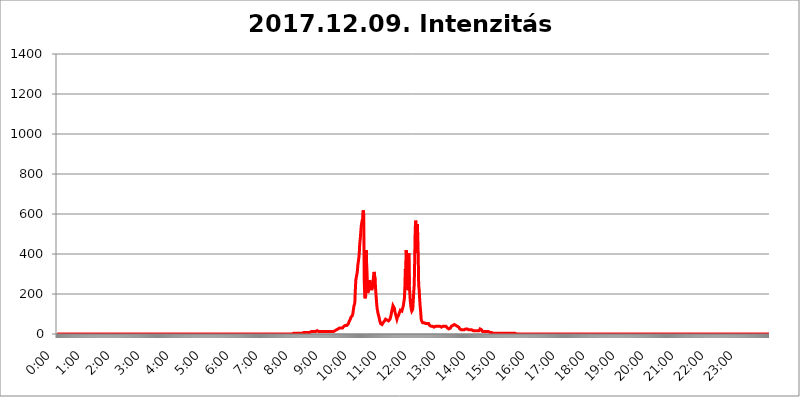
| Category | 2017.12.09. Intenzitás [W/m^2] |
|---|---|
| 0.0 | 0 |
| 0.0006944444444444445 | 0 |
| 0.001388888888888889 | 0 |
| 0.0020833333333333333 | 0 |
| 0.002777777777777778 | 0 |
| 0.003472222222222222 | 0 |
| 0.004166666666666667 | 0 |
| 0.004861111111111111 | 0 |
| 0.005555555555555556 | 0 |
| 0.0062499999999999995 | 0 |
| 0.006944444444444444 | 0 |
| 0.007638888888888889 | 0 |
| 0.008333333333333333 | 0 |
| 0.009027777777777779 | 0 |
| 0.009722222222222222 | 0 |
| 0.010416666666666666 | 0 |
| 0.011111111111111112 | 0 |
| 0.011805555555555555 | 0 |
| 0.012499999999999999 | 0 |
| 0.013194444444444444 | 0 |
| 0.013888888888888888 | 0 |
| 0.014583333333333332 | 0 |
| 0.015277777777777777 | 0 |
| 0.015972222222222224 | 0 |
| 0.016666666666666666 | 0 |
| 0.017361111111111112 | 0 |
| 0.018055555555555557 | 0 |
| 0.01875 | 0 |
| 0.019444444444444445 | 0 |
| 0.02013888888888889 | 0 |
| 0.020833333333333332 | 0 |
| 0.02152777777777778 | 0 |
| 0.022222222222222223 | 0 |
| 0.02291666666666667 | 0 |
| 0.02361111111111111 | 0 |
| 0.024305555555555556 | 0 |
| 0.024999999999999998 | 0 |
| 0.025694444444444447 | 0 |
| 0.02638888888888889 | 0 |
| 0.027083333333333334 | 0 |
| 0.027777777777777776 | 0 |
| 0.02847222222222222 | 0 |
| 0.029166666666666664 | 0 |
| 0.029861111111111113 | 0 |
| 0.030555555555555555 | 0 |
| 0.03125 | 0 |
| 0.03194444444444445 | 0 |
| 0.03263888888888889 | 0 |
| 0.03333333333333333 | 0 |
| 0.034027777777777775 | 0 |
| 0.034722222222222224 | 0 |
| 0.035416666666666666 | 0 |
| 0.036111111111111115 | 0 |
| 0.03680555555555556 | 0 |
| 0.0375 | 0 |
| 0.03819444444444444 | 0 |
| 0.03888888888888889 | 0 |
| 0.03958333333333333 | 0 |
| 0.04027777777777778 | 0 |
| 0.04097222222222222 | 0 |
| 0.041666666666666664 | 0 |
| 0.042361111111111106 | 0 |
| 0.04305555555555556 | 0 |
| 0.043750000000000004 | 0 |
| 0.044444444444444446 | 0 |
| 0.04513888888888889 | 0 |
| 0.04583333333333334 | 0 |
| 0.04652777777777778 | 0 |
| 0.04722222222222222 | 0 |
| 0.04791666666666666 | 0 |
| 0.04861111111111111 | 0 |
| 0.049305555555555554 | 0 |
| 0.049999999999999996 | 0 |
| 0.05069444444444445 | 0 |
| 0.051388888888888894 | 0 |
| 0.052083333333333336 | 0 |
| 0.05277777777777778 | 0 |
| 0.05347222222222222 | 0 |
| 0.05416666666666667 | 0 |
| 0.05486111111111111 | 0 |
| 0.05555555555555555 | 0 |
| 0.05625 | 0 |
| 0.05694444444444444 | 0 |
| 0.057638888888888885 | 0 |
| 0.05833333333333333 | 0 |
| 0.05902777777777778 | 0 |
| 0.059722222222222225 | 0 |
| 0.06041666666666667 | 0 |
| 0.061111111111111116 | 0 |
| 0.06180555555555556 | 0 |
| 0.0625 | 0 |
| 0.06319444444444444 | 0 |
| 0.06388888888888888 | 0 |
| 0.06458333333333334 | 0 |
| 0.06527777777777778 | 0 |
| 0.06597222222222222 | 0 |
| 0.06666666666666667 | 0 |
| 0.06736111111111111 | 0 |
| 0.06805555555555555 | 0 |
| 0.06874999999999999 | 0 |
| 0.06944444444444443 | 0 |
| 0.07013888888888889 | 0 |
| 0.07083333333333333 | 0 |
| 0.07152777777777779 | 0 |
| 0.07222222222222223 | 0 |
| 0.07291666666666667 | 0 |
| 0.07361111111111111 | 0 |
| 0.07430555555555556 | 0 |
| 0.075 | 0 |
| 0.07569444444444444 | 0 |
| 0.0763888888888889 | 0 |
| 0.07708333333333334 | 0 |
| 0.07777777777777778 | 0 |
| 0.07847222222222222 | 0 |
| 0.07916666666666666 | 0 |
| 0.0798611111111111 | 0 |
| 0.08055555555555556 | 0 |
| 0.08125 | 0 |
| 0.08194444444444444 | 0 |
| 0.08263888888888889 | 0 |
| 0.08333333333333333 | 0 |
| 0.08402777777777777 | 0 |
| 0.08472222222222221 | 0 |
| 0.08541666666666665 | 0 |
| 0.08611111111111112 | 0 |
| 0.08680555555555557 | 0 |
| 0.08750000000000001 | 0 |
| 0.08819444444444445 | 0 |
| 0.08888888888888889 | 0 |
| 0.08958333333333333 | 0 |
| 0.09027777777777778 | 0 |
| 0.09097222222222222 | 0 |
| 0.09166666666666667 | 0 |
| 0.09236111111111112 | 0 |
| 0.09305555555555556 | 0 |
| 0.09375 | 0 |
| 0.09444444444444444 | 0 |
| 0.09513888888888888 | 0 |
| 0.09583333333333333 | 0 |
| 0.09652777777777777 | 0 |
| 0.09722222222222222 | 0 |
| 0.09791666666666667 | 0 |
| 0.09861111111111111 | 0 |
| 0.09930555555555555 | 0 |
| 0.09999999999999999 | 0 |
| 0.10069444444444443 | 0 |
| 0.1013888888888889 | 0 |
| 0.10208333333333335 | 0 |
| 0.10277777777777779 | 0 |
| 0.10347222222222223 | 0 |
| 0.10416666666666667 | 0 |
| 0.10486111111111111 | 0 |
| 0.10555555555555556 | 0 |
| 0.10625 | 0 |
| 0.10694444444444444 | 0 |
| 0.1076388888888889 | 0 |
| 0.10833333333333334 | 0 |
| 0.10902777777777778 | 0 |
| 0.10972222222222222 | 0 |
| 0.1111111111111111 | 0 |
| 0.11180555555555556 | 0 |
| 0.11180555555555556 | 0 |
| 0.1125 | 0 |
| 0.11319444444444444 | 0 |
| 0.11388888888888889 | 0 |
| 0.11458333333333333 | 0 |
| 0.11527777777777777 | 0 |
| 0.11597222222222221 | 0 |
| 0.11666666666666665 | 0 |
| 0.1173611111111111 | 0 |
| 0.11805555555555557 | 0 |
| 0.11944444444444445 | 0 |
| 0.12013888888888889 | 0 |
| 0.12083333333333333 | 0 |
| 0.12152777777777778 | 0 |
| 0.12222222222222223 | 0 |
| 0.12291666666666667 | 0 |
| 0.12291666666666667 | 0 |
| 0.12361111111111112 | 0 |
| 0.12430555555555556 | 0 |
| 0.125 | 0 |
| 0.12569444444444444 | 0 |
| 0.12638888888888888 | 0 |
| 0.12708333333333333 | 0 |
| 0.16875 | 0 |
| 0.12847222222222224 | 0 |
| 0.12916666666666668 | 0 |
| 0.12986111111111112 | 0 |
| 0.13055555555555556 | 0 |
| 0.13125 | 0 |
| 0.13194444444444445 | 0 |
| 0.1326388888888889 | 0 |
| 0.13333333333333333 | 0 |
| 0.13402777777777777 | 0 |
| 0.13402777777777777 | 0 |
| 0.13472222222222222 | 0 |
| 0.13541666666666666 | 0 |
| 0.1361111111111111 | 0 |
| 0.13749999999999998 | 0 |
| 0.13819444444444443 | 0 |
| 0.1388888888888889 | 0 |
| 0.13958333333333334 | 0 |
| 0.14027777777777778 | 0 |
| 0.14097222222222222 | 0 |
| 0.14166666666666666 | 0 |
| 0.1423611111111111 | 0 |
| 0.14305555555555557 | 0 |
| 0.14375000000000002 | 0 |
| 0.14444444444444446 | 0 |
| 0.1451388888888889 | 0 |
| 0.1451388888888889 | 0 |
| 0.14652777777777778 | 0 |
| 0.14722222222222223 | 0 |
| 0.14791666666666667 | 0 |
| 0.1486111111111111 | 0 |
| 0.14930555555555555 | 0 |
| 0.15 | 0 |
| 0.15069444444444444 | 0 |
| 0.15138888888888888 | 0 |
| 0.15208333333333332 | 0 |
| 0.15277777777777776 | 0 |
| 0.15347222222222223 | 0 |
| 0.15416666666666667 | 0 |
| 0.15486111111111112 | 0 |
| 0.15555555555555556 | 0 |
| 0.15625 | 0 |
| 0.15694444444444444 | 0 |
| 0.15763888888888888 | 0 |
| 0.15833333333333333 | 0 |
| 0.15902777777777777 | 0 |
| 0.15972222222222224 | 0 |
| 0.16041666666666668 | 0 |
| 0.16111111111111112 | 0 |
| 0.16180555555555556 | 0 |
| 0.1625 | 0 |
| 0.16319444444444445 | 0 |
| 0.1638888888888889 | 0 |
| 0.16458333333333333 | 0 |
| 0.16527777777777777 | 0 |
| 0.16597222222222222 | 0 |
| 0.16666666666666666 | 0 |
| 0.1673611111111111 | 0 |
| 0.16805555555555554 | 0 |
| 0.16874999999999998 | 0 |
| 0.16944444444444443 | 0 |
| 0.17013888888888887 | 0 |
| 0.1708333333333333 | 0 |
| 0.17152777777777775 | 0 |
| 0.17222222222222225 | 0 |
| 0.1729166666666667 | 0 |
| 0.17361111111111113 | 0 |
| 0.17430555555555557 | 0 |
| 0.17500000000000002 | 0 |
| 0.17569444444444446 | 0 |
| 0.1763888888888889 | 0 |
| 0.17708333333333334 | 0 |
| 0.17777777777777778 | 0 |
| 0.17847222222222223 | 0 |
| 0.17916666666666667 | 0 |
| 0.1798611111111111 | 0 |
| 0.18055555555555555 | 0 |
| 0.18125 | 0 |
| 0.18194444444444444 | 0 |
| 0.1826388888888889 | 0 |
| 0.18333333333333335 | 0 |
| 0.1840277777777778 | 0 |
| 0.18472222222222223 | 0 |
| 0.18541666666666667 | 0 |
| 0.18611111111111112 | 0 |
| 0.18680555555555556 | 0 |
| 0.1875 | 0 |
| 0.18819444444444444 | 0 |
| 0.18888888888888888 | 0 |
| 0.18958333333333333 | 0 |
| 0.19027777777777777 | 0 |
| 0.1909722222222222 | 0 |
| 0.19166666666666665 | 0 |
| 0.19236111111111112 | 0 |
| 0.19305555555555554 | 0 |
| 0.19375 | 0 |
| 0.19444444444444445 | 0 |
| 0.1951388888888889 | 0 |
| 0.19583333333333333 | 0 |
| 0.19652777777777777 | 0 |
| 0.19722222222222222 | 0 |
| 0.19791666666666666 | 0 |
| 0.1986111111111111 | 0 |
| 0.19930555555555554 | 0 |
| 0.19999999999999998 | 0 |
| 0.20069444444444443 | 0 |
| 0.20138888888888887 | 0 |
| 0.2020833333333333 | 0 |
| 0.2027777777777778 | 0 |
| 0.2034722222222222 | 0 |
| 0.2041666666666667 | 0 |
| 0.20486111111111113 | 0 |
| 0.20555555555555557 | 0 |
| 0.20625000000000002 | 0 |
| 0.20694444444444446 | 0 |
| 0.2076388888888889 | 0 |
| 0.20833333333333334 | 0 |
| 0.20902777777777778 | 0 |
| 0.20972222222222223 | 0 |
| 0.21041666666666667 | 0 |
| 0.2111111111111111 | 0 |
| 0.21180555555555555 | 0 |
| 0.2125 | 0 |
| 0.21319444444444444 | 0 |
| 0.2138888888888889 | 0 |
| 0.21458333333333335 | 0 |
| 0.2152777777777778 | 0 |
| 0.21597222222222223 | 0 |
| 0.21666666666666667 | 0 |
| 0.21736111111111112 | 0 |
| 0.21805555555555556 | 0 |
| 0.21875 | 0 |
| 0.21944444444444444 | 0 |
| 0.22013888888888888 | 0 |
| 0.22083333333333333 | 0 |
| 0.22152777777777777 | 0 |
| 0.2222222222222222 | 0 |
| 0.22291666666666665 | 0 |
| 0.2236111111111111 | 0 |
| 0.22430555555555556 | 0 |
| 0.225 | 0 |
| 0.22569444444444445 | 0 |
| 0.2263888888888889 | 0 |
| 0.22708333333333333 | 0 |
| 0.22777777777777777 | 0 |
| 0.22847222222222222 | 0 |
| 0.22916666666666666 | 0 |
| 0.2298611111111111 | 0 |
| 0.23055555555555554 | 0 |
| 0.23124999999999998 | 0 |
| 0.23194444444444443 | 0 |
| 0.23263888888888887 | 0 |
| 0.2333333333333333 | 0 |
| 0.2340277777777778 | 0 |
| 0.2347222222222222 | 0 |
| 0.2354166666666667 | 0 |
| 0.23611111111111113 | 0 |
| 0.23680555555555557 | 0 |
| 0.23750000000000002 | 0 |
| 0.23819444444444446 | 0 |
| 0.2388888888888889 | 0 |
| 0.23958333333333334 | 0 |
| 0.24027777777777778 | 0 |
| 0.24097222222222223 | 0 |
| 0.24166666666666667 | 0 |
| 0.2423611111111111 | 0 |
| 0.24305555555555555 | 0 |
| 0.24375 | 0 |
| 0.24444444444444446 | 0 |
| 0.24513888888888888 | 0 |
| 0.24583333333333335 | 0 |
| 0.2465277777777778 | 0 |
| 0.24722222222222223 | 0 |
| 0.24791666666666667 | 0 |
| 0.24861111111111112 | 0 |
| 0.24930555555555556 | 0 |
| 0.25 | 0 |
| 0.25069444444444444 | 0 |
| 0.2513888888888889 | 0 |
| 0.2520833333333333 | 0 |
| 0.25277777777777777 | 0 |
| 0.2534722222222222 | 0 |
| 0.25416666666666665 | 0 |
| 0.2548611111111111 | 0 |
| 0.2555555555555556 | 0 |
| 0.25625000000000003 | 0 |
| 0.2569444444444445 | 0 |
| 0.2576388888888889 | 0 |
| 0.25833333333333336 | 0 |
| 0.2590277777777778 | 0 |
| 0.25972222222222224 | 0 |
| 0.2604166666666667 | 0 |
| 0.2611111111111111 | 0 |
| 0.26180555555555557 | 0 |
| 0.2625 | 0 |
| 0.26319444444444445 | 0 |
| 0.2638888888888889 | 0 |
| 0.26458333333333334 | 0 |
| 0.2652777777777778 | 0 |
| 0.2659722222222222 | 0 |
| 0.26666666666666666 | 0 |
| 0.2673611111111111 | 0 |
| 0.26805555555555555 | 0 |
| 0.26875 | 0 |
| 0.26944444444444443 | 0 |
| 0.2701388888888889 | 0 |
| 0.2708333333333333 | 0 |
| 0.27152777777777776 | 0 |
| 0.2722222222222222 | 0 |
| 0.27291666666666664 | 0 |
| 0.2736111111111111 | 0 |
| 0.2743055555555555 | 0 |
| 0.27499999999999997 | 0 |
| 0.27569444444444446 | 0 |
| 0.27638888888888885 | 0 |
| 0.27708333333333335 | 0 |
| 0.2777777777777778 | 0 |
| 0.27847222222222223 | 0 |
| 0.2791666666666667 | 0 |
| 0.2798611111111111 | 0 |
| 0.28055555555555556 | 0 |
| 0.28125 | 0 |
| 0.28194444444444444 | 0 |
| 0.2826388888888889 | 0 |
| 0.2833333333333333 | 0 |
| 0.28402777777777777 | 0 |
| 0.2847222222222222 | 0 |
| 0.28541666666666665 | 0 |
| 0.28611111111111115 | 0 |
| 0.28680555555555554 | 0 |
| 0.28750000000000003 | 0 |
| 0.2881944444444445 | 0 |
| 0.2888888888888889 | 0 |
| 0.28958333333333336 | 0 |
| 0.2902777777777778 | 0 |
| 0.29097222222222224 | 0 |
| 0.2916666666666667 | 0 |
| 0.2923611111111111 | 0 |
| 0.29305555555555557 | 0 |
| 0.29375 | 0 |
| 0.29444444444444445 | 0 |
| 0.2951388888888889 | 0 |
| 0.29583333333333334 | 0 |
| 0.2965277777777778 | 0 |
| 0.2972222222222222 | 0 |
| 0.29791666666666666 | 0 |
| 0.2986111111111111 | 0 |
| 0.29930555555555555 | 0 |
| 0.3 | 0 |
| 0.30069444444444443 | 0 |
| 0.3013888888888889 | 0 |
| 0.3020833333333333 | 0 |
| 0.30277777777777776 | 0 |
| 0.3034722222222222 | 0 |
| 0.30416666666666664 | 0 |
| 0.3048611111111111 | 0 |
| 0.3055555555555555 | 0 |
| 0.30624999999999997 | 0 |
| 0.3069444444444444 | 0 |
| 0.3076388888888889 | 0 |
| 0.30833333333333335 | 0 |
| 0.3090277777777778 | 0 |
| 0.30972222222222223 | 0 |
| 0.3104166666666667 | 0 |
| 0.3111111111111111 | 0 |
| 0.31180555555555556 | 0 |
| 0.3125 | 0 |
| 0.31319444444444444 | 0 |
| 0.3138888888888889 | 0 |
| 0.3145833333333333 | 0 |
| 0.31527777777777777 | 0 |
| 0.3159722222222222 | 0 |
| 0.31666666666666665 | 0 |
| 0.31736111111111115 | 0 |
| 0.31805555555555554 | 0 |
| 0.31875000000000003 | 0 |
| 0.3194444444444445 | 0 |
| 0.3201388888888889 | 0 |
| 0.32083333333333336 | 0 |
| 0.3215277777777778 | 0 |
| 0.32222222222222224 | 0 |
| 0.3229166666666667 | 0 |
| 0.3236111111111111 | 0 |
| 0.32430555555555557 | 0 |
| 0.325 | 0 |
| 0.32569444444444445 | 0 |
| 0.3263888888888889 | 0 |
| 0.32708333333333334 | 0 |
| 0.3277777777777778 | 0 |
| 0.3284722222222222 | 3.525 |
| 0.32916666666666666 | 0 |
| 0.3298611111111111 | 3.525 |
| 0.33055555555555555 | 3.525 |
| 0.33125 | 3.525 |
| 0.33194444444444443 | 3.525 |
| 0.3326388888888889 | 3.525 |
| 0.3333333333333333 | 3.525 |
| 0.3340277777777778 | 3.525 |
| 0.3347222222222222 | 3.525 |
| 0.3354166666666667 | 3.525 |
| 0.3361111111111111 | 3.525 |
| 0.3368055555555556 | 3.525 |
| 0.33749999999999997 | 3.525 |
| 0.33819444444444446 | 3.525 |
| 0.33888888888888885 | 3.525 |
| 0.33958333333333335 | 3.525 |
| 0.34027777777777773 | 3.525 |
| 0.34097222222222223 | 3.525 |
| 0.3416666666666666 | 3.525 |
| 0.3423611111111111 | 3.525 |
| 0.3430555555555555 | 3.525 |
| 0.34375 | 3.525 |
| 0.3444444444444445 | 3.525 |
| 0.3451388888888889 | 7.887 |
| 0.3458333333333334 | 7.887 |
| 0.34652777777777777 | 7.887 |
| 0.34722222222222227 | 7.887 |
| 0.34791666666666665 | 7.887 |
| 0.34861111111111115 | 7.887 |
| 0.34930555555555554 | 7.887 |
| 0.35000000000000003 | 7.887 |
| 0.3506944444444444 | 7.887 |
| 0.3513888888888889 | 7.887 |
| 0.3520833333333333 | 7.887 |
| 0.3527777777777778 | 7.887 |
| 0.3534722222222222 | 7.887 |
| 0.3541666666666667 | 7.887 |
| 0.3548611111111111 | 7.887 |
| 0.35555555555555557 | 12.257 |
| 0.35625 | 12.257 |
| 0.35694444444444445 | 12.257 |
| 0.3576388888888889 | 12.257 |
| 0.35833333333333334 | 12.257 |
| 0.3590277777777778 | 12.257 |
| 0.3597222222222222 | 12.257 |
| 0.36041666666666666 | 12.257 |
| 0.3611111111111111 | 12.257 |
| 0.36180555555555555 | 12.257 |
| 0.3625 | 12.257 |
| 0.36319444444444443 | 12.257 |
| 0.3638888888888889 | 12.257 |
| 0.3645833333333333 | 16.636 |
| 0.3652777777777778 | 16.636 |
| 0.3659722222222222 | 16.636 |
| 0.3666666666666667 | 12.257 |
| 0.3673611111111111 | 12.257 |
| 0.3680555555555556 | 16.636 |
| 0.36874999999999997 | 12.257 |
| 0.36944444444444446 | 12.257 |
| 0.37013888888888885 | 12.257 |
| 0.37083333333333335 | 12.257 |
| 0.37152777777777773 | 12.257 |
| 0.37222222222222223 | 12.257 |
| 0.3729166666666666 | 12.257 |
| 0.3736111111111111 | 12.257 |
| 0.3743055555555555 | 12.257 |
| 0.375 | 12.257 |
| 0.3756944444444445 | 12.257 |
| 0.3763888888888889 | 12.257 |
| 0.3770833333333334 | 12.257 |
| 0.37777777777777777 | 12.257 |
| 0.37847222222222227 | 12.257 |
| 0.37916666666666665 | 12.257 |
| 0.37986111111111115 | 12.257 |
| 0.38055555555555554 | 12.257 |
| 0.38125000000000003 | 12.257 |
| 0.3819444444444444 | 12.257 |
| 0.3826388888888889 | 12.257 |
| 0.3833333333333333 | 12.257 |
| 0.3840277777777778 | 12.257 |
| 0.3847222222222222 | 12.257 |
| 0.3854166666666667 | 12.257 |
| 0.3861111111111111 | 12.257 |
| 0.38680555555555557 | 12.257 |
| 0.3875 | 12.257 |
| 0.38819444444444445 | 12.257 |
| 0.3888888888888889 | 16.636 |
| 0.38958333333333334 | 16.636 |
| 0.3902777777777778 | 21.024 |
| 0.3909722222222222 | 21.024 |
| 0.39166666666666666 | 21.024 |
| 0.3923611111111111 | 25.419 |
| 0.39305555555555555 | 25.419 |
| 0.39375 | 25.419 |
| 0.39444444444444443 | 25.419 |
| 0.3951388888888889 | 25.419 |
| 0.3958333333333333 | 29.823 |
| 0.3965277777777778 | 29.823 |
| 0.3972222222222222 | 29.823 |
| 0.3979166666666667 | 29.823 |
| 0.3986111111111111 | 29.823 |
| 0.3993055555555556 | 29.823 |
| 0.39999999999999997 | 29.823 |
| 0.40069444444444446 | 34.234 |
| 0.40138888888888885 | 34.234 |
| 0.40208333333333335 | 38.653 |
| 0.40277777777777773 | 38.653 |
| 0.40347222222222223 | 43.079 |
| 0.4041666666666666 | 43.079 |
| 0.4048611111111111 | 43.079 |
| 0.4055555555555555 | 43.079 |
| 0.40625 | 43.079 |
| 0.4069444444444445 | 43.079 |
| 0.4076388888888889 | 47.511 |
| 0.4083333333333334 | 51.951 |
| 0.40902777777777777 | 56.398 |
| 0.40972222222222227 | 65.31 |
| 0.41041666666666665 | 69.775 |
| 0.41111111111111115 | 74.246 |
| 0.41180555555555554 | 83.205 |
| 0.41250000000000003 | 83.205 |
| 0.4131944444444444 | 87.692 |
| 0.4138888888888889 | 92.184 |
| 0.4145833333333333 | 101.184 |
| 0.4152777777777778 | 119.235 |
| 0.4159722222222222 | 137.347 |
| 0.4166666666666667 | 146.423 |
| 0.4173611111111111 | 155.509 |
| 0.41805555555555557 | 219.309 |
| 0.41875 | 269.49 |
| 0.41944444444444445 | 283.156 |
| 0.4201388888888889 | 296.808 |
| 0.42083333333333334 | 310.44 |
| 0.4215277777777778 | 342.162 |
| 0.4222222222222222 | 360.221 |
| 0.42291666666666666 | 378.224 |
| 0.4236111111111111 | 405.108 |
| 0.42430555555555555 | 453.968 |
| 0.425 | 475.972 |
| 0.42569444444444443 | 475.972 |
| 0.4263888888888889 | 541.121 |
| 0.4270833333333333 | 536.82 |
| 0.4277777777777778 | 571.049 |
| 0.4284722222222222 | 562.53 |
| 0.4291666666666667 | 617.436 |
| 0.4298611111111111 | 596.45 |
| 0.4305555555555556 | 269.49 |
| 0.43124999999999997 | 187.378 |
| 0.43194444444444446 | 178.264 |
| 0.43263888888888885 | 191.937 |
| 0.43333333333333335 | 418.492 |
| 0.43402777777777773 | 422.943 |
| 0.43472222222222223 | 233 |
| 0.4354166666666666 | 205.62 |
| 0.4361111111111111 | 201.058 |
| 0.4368055555555555 | 210.182 |
| 0.4375 | 228.436 |
| 0.4381944444444445 | 269.49 |
| 0.4388888888888889 | 264.932 |
| 0.4395833333333334 | 269.49 |
| 0.44027777777777777 | 228.436 |
| 0.44097222222222227 | 219.309 |
| 0.44166666666666665 | 223.873 |
| 0.44236111111111115 | 242.127 |
| 0.44305555555555554 | 264.932 |
| 0.44375000000000003 | 292.259 |
| 0.4444444444444444 | 310.44 |
| 0.4451388888888889 | 305.898 |
| 0.4458333333333333 | 269.49 |
| 0.4465277777777778 | 223.873 |
| 0.4472222222222222 | 187.378 |
| 0.4479166666666667 | 155.509 |
| 0.4486111111111111 | 128.284 |
| 0.44930555555555557 | 114.716 |
| 0.45 | 101.184 |
| 0.45069444444444445 | 92.184 |
| 0.4513888888888889 | 83.205 |
| 0.45208333333333334 | 69.775 |
| 0.4527777777777778 | 60.85 |
| 0.4534722222222222 | 51.951 |
| 0.45416666666666666 | 47.511 |
| 0.4548611111111111 | 47.511 |
| 0.45555555555555555 | 47.511 |
| 0.45625 | 51.951 |
| 0.45694444444444443 | 56.398 |
| 0.4576388888888889 | 60.85 |
| 0.4583333333333333 | 60.85 |
| 0.4590277777777778 | 65.31 |
| 0.4597222222222222 | 69.775 |
| 0.4604166666666667 | 74.246 |
| 0.4611111111111111 | 74.246 |
| 0.4618055555555556 | 69.775 |
| 0.46249999999999997 | 69.775 |
| 0.46319444444444446 | 65.31 |
| 0.46388888888888885 | 65.31 |
| 0.46458333333333335 | 65.31 |
| 0.46527777777777773 | 65.31 |
| 0.46597222222222223 | 69.775 |
| 0.4666666666666666 | 74.246 |
| 0.4673611111111111 | 83.205 |
| 0.4680555555555555 | 92.184 |
| 0.46875 | 105.69 |
| 0.4694444444444445 | 119.235 |
| 0.4701388888888889 | 128.284 |
| 0.4708333333333334 | 141.884 |
| 0.47152777777777777 | 146.423 |
| 0.47222222222222227 | 141.884 |
| 0.47291666666666665 | 128.284 |
| 0.47361111111111115 | 110.201 |
| 0.47430555555555554 | 101.184 |
| 0.47500000000000003 | 92.184 |
| 0.4756944444444444 | 83.205 |
| 0.4763888888888889 | 74.246 |
| 0.4770833333333333 | 83.205 |
| 0.4777777777777778 | 83.205 |
| 0.4784722222222222 | 92.184 |
| 0.4791666666666667 | 96.682 |
| 0.4798611111111111 | 105.69 |
| 0.48055555555555557 | 110.201 |
| 0.48125 | 119.235 |
| 0.48194444444444445 | 123.758 |
| 0.4826388888888889 | 114.716 |
| 0.48333333333333334 | 114.716 |
| 0.4840277777777778 | 123.758 |
| 0.4847222222222222 | 128.284 |
| 0.48541666666666666 | 141.884 |
| 0.4861111111111111 | 160.056 |
| 0.48680555555555555 | 173.709 |
| 0.4875 | 228.436 |
| 0.48819444444444443 | 324.052 |
| 0.4888888888888889 | 287.709 |
| 0.4895833333333333 | 418.492 |
| 0.4902777777777778 | 346.682 |
| 0.4909722222222222 | 287.709 |
| 0.4916666666666667 | 219.309 |
| 0.4923611111111111 | 351.198 |
| 0.4930555555555556 | 405.108 |
| 0.49374999999999997 | 242.127 |
| 0.49444444444444446 | 205.62 |
| 0.49513888888888885 | 164.605 |
| 0.49583333333333335 | 141.884 |
| 0.49652777777777773 | 123.758 |
| 0.49722222222222223 | 114.716 |
| 0.4979166666666666 | 114.716 |
| 0.4986111111111111 | 123.758 |
| 0.4993055555555555 | 164.605 |
| 0.5 | 210.182 |
| 0.5006944444444444 | 246.689 |
| 0.5013888888888889 | 378.224 |
| 0.5020833333333333 | 528.2 |
| 0.5027777777777778 | 566.793 |
| 0.5034722222222222 | 453.968 |
| 0.5041666666666667 | 405.108 |
| 0.5048611111111111 | 549.704 |
| 0.5055555555555555 | 497.836 |
| 0.50625 | 396.164 |
| 0.5069444444444444 | 242.127 |
| 0.5076388888888889 | 219.309 |
| 0.5083333333333333 | 173.709 |
| 0.5090277777777777 | 137.347 |
| 0.5097222222222222 | 110.201 |
| 0.5104166666666666 | 74.246 |
| 0.5111111111111112 | 65.31 |
| 0.5118055555555555 | 60.85 |
| 0.5125000000000001 | 56.398 |
| 0.5131944444444444 | 60.85 |
| 0.513888888888889 | 56.398 |
| 0.5145833333333333 | 56.398 |
| 0.5152777777777778 | 56.398 |
| 0.5159722222222222 | 56.398 |
| 0.5166666666666667 | 51.951 |
| 0.517361111111111 | 51.951 |
| 0.5180555555555556 | 51.951 |
| 0.5187499999999999 | 51.951 |
| 0.5194444444444445 | 56.398 |
| 0.5201388888888888 | 56.398 |
| 0.5208333333333334 | 51.951 |
| 0.5215277777777778 | 47.511 |
| 0.5222222222222223 | 43.079 |
| 0.5229166666666667 | 43.079 |
| 0.5236111111111111 | 38.653 |
| 0.5243055555555556 | 38.653 |
| 0.525 | 38.653 |
| 0.5256944444444445 | 38.653 |
| 0.5263888888888889 | 38.653 |
| 0.5270833333333333 | 34.234 |
| 0.5277777777777778 | 34.234 |
| 0.5284722222222222 | 34.234 |
| 0.5291666666666667 | 34.234 |
| 0.5298611111111111 | 38.653 |
| 0.5305555555555556 | 38.653 |
| 0.53125 | 38.653 |
| 0.5319444444444444 | 38.653 |
| 0.5326388888888889 | 38.653 |
| 0.5333333333333333 | 38.653 |
| 0.5340277777777778 | 38.653 |
| 0.5347222222222222 | 38.653 |
| 0.5354166666666667 | 38.653 |
| 0.5361111111111111 | 38.653 |
| 0.5368055555555555 | 38.653 |
| 0.5375 | 34.234 |
| 0.5381944444444444 | 34.234 |
| 0.5388888888888889 | 34.234 |
| 0.5395833333333333 | 38.653 |
| 0.5402777777777777 | 38.653 |
| 0.5409722222222222 | 38.653 |
| 0.5416666666666666 | 38.653 |
| 0.5423611111111112 | 43.079 |
| 0.5430555555555555 | 38.653 |
| 0.5437500000000001 | 34.234 |
| 0.5444444444444444 | 38.653 |
| 0.545138888888889 | 38.653 |
| 0.5458333333333333 | 38.653 |
| 0.5465277777777778 | 38.653 |
| 0.5472222222222222 | 29.823 |
| 0.5479166666666667 | 29.823 |
| 0.548611111111111 | 25.419 |
| 0.5493055555555556 | 25.419 |
| 0.5499999999999999 | 25.419 |
| 0.5506944444444445 | 29.823 |
| 0.5513888888888888 | 29.823 |
| 0.5520833333333334 | 34.234 |
| 0.5527777777777778 | 38.653 |
| 0.5534722222222223 | 38.653 |
| 0.5541666666666667 | 43.079 |
| 0.5548611111111111 | 43.079 |
| 0.5555555555555556 | 47.511 |
| 0.55625 | 47.511 |
| 0.5569444444444445 | 47.511 |
| 0.5576388888888889 | 47.511 |
| 0.5583333333333333 | 47.511 |
| 0.5590277777777778 | 43.079 |
| 0.5597222222222222 | 43.079 |
| 0.5604166666666667 | 38.653 |
| 0.5611111111111111 | 38.653 |
| 0.5618055555555556 | 38.653 |
| 0.5625 | 34.234 |
| 0.5631944444444444 | 34.234 |
| 0.5638888888888889 | 29.823 |
| 0.5645833333333333 | 25.419 |
| 0.5652777777777778 | 21.024 |
| 0.5659722222222222 | 21.024 |
| 0.5666666666666667 | 21.024 |
| 0.5673611111111111 | 16.636 |
| 0.5680555555555555 | 16.636 |
| 0.56875 | 21.024 |
| 0.5694444444444444 | 21.024 |
| 0.5701388888888889 | 21.024 |
| 0.5708333333333333 | 21.024 |
| 0.5715277777777777 | 25.419 |
| 0.5722222222222222 | 25.419 |
| 0.5729166666666666 | 25.419 |
| 0.5736111111111112 | 25.419 |
| 0.5743055555555555 | 25.419 |
| 0.5750000000000001 | 25.419 |
| 0.5756944444444444 | 25.419 |
| 0.576388888888889 | 25.419 |
| 0.5770833333333333 | 21.024 |
| 0.5777777777777778 | 21.024 |
| 0.5784722222222222 | 21.024 |
| 0.5791666666666667 | 21.024 |
| 0.579861111111111 | 21.024 |
| 0.5805555555555556 | 21.024 |
| 0.5812499999999999 | 21.024 |
| 0.5819444444444445 | 16.636 |
| 0.5826388888888888 | 16.636 |
| 0.5833333333333334 | 16.636 |
| 0.5840277777777778 | 16.636 |
| 0.5847222222222223 | 16.636 |
| 0.5854166666666667 | 16.636 |
| 0.5861111111111111 | 12.257 |
| 0.5868055555555556 | 12.257 |
| 0.5875 | 16.636 |
| 0.5881944444444445 | 16.636 |
| 0.5888888888888889 | 16.636 |
| 0.5895833333333333 | 16.636 |
| 0.5902777777777778 | 16.636 |
| 0.5909722222222222 | 16.636 |
| 0.5916666666666667 | 16.636 |
| 0.5923611111111111 | 21.024 |
| 0.5930555555555556 | 25.419 |
| 0.59375 | 25.419 |
| 0.5944444444444444 | 25.419 |
| 0.5951388888888889 | 21.024 |
| 0.5958333333333333 | 16.636 |
| 0.5965277777777778 | 12.257 |
| 0.5972222222222222 | 12.257 |
| 0.5979166666666667 | 12.257 |
| 0.5986111111111111 | 12.257 |
| 0.5993055555555555 | 12.257 |
| 0.6 | 12.257 |
| 0.6006944444444444 | 12.257 |
| 0.6013888888888889 | 12.257 |
| 0.6020833333333333 | 12.257 |
| 0.6027777777777777 | 12.257 |
| 0.6034722222222222 | 12.257 |
| 0.6041666666666666 | 12.257 |
| 0.6048611111111112 | 12.257 |
| 0.6055555555555555 | 7.887 |
| 0.6062500000000001 | 7.887 |
| 0.6069444444444444 | 7.887 |
| 0.607638888888889 | 7.887 |
| 0.6083333333333333 | 7.887 |
| 0.6090277777777778 | 7.887 |
| 0.6097222222222222 | 7.887 |
| 0.6104166666666667 | 7.887 |
| 0.611111111111111 | 3.525 |
| 0.6118055555555556 | 3.525 |
| 0.6124999999999999 | 3.525 |
| 0.6131944444444445 | 3.525 |
| 0.6138888888888888 | 3.525 |
| 0.6145833333333334 | 3.525 |
| 0.6152777777777778 | 3.525 |
| 0.6159722222222223 | 3.525 |
| 0.6166666666666667 | 3.525 |
| 0.6173611111111111 | 3.525 |
| 0.6180555555555556 | 3.525 |
| 0.61875 | 3.525 |
| 0.6194444444444445 | 3.525 |
| 0.6201388888888889 | 3.525 |
| 0.6208333333333333 | 3.525 |
| 0.6215277777777778 | 3.525 |
| 0.6222222222222222 | 3.525 |
| 0.6229166666666667 | 3.525 |
| 0.6236111111111111 | 3.525 |
| 0.6243055555555556 | 3.525 |
| 0.625 | 3.525 |
| 0.6256944444444444 | 3.525 |
| 0.6263888888888889 | 3.525 |
| 0.6270833333333333 | 3.525 |
| 0.6277777777777778 | 3.525 |
| 0.6284722222222222 | 3.525 |
| 0.6291666666666667 | 3.525 |
| 0.6298611111111111 | 3.525 |
| 0.6305555555555555 | 3.525 |
| 0.63125 | 3.525 |
| 0.6319444444444444 | 3.525 |
| 0.6326388888888889 | 3.525 |
| 0.6333333333333333 | 3.525 |
| 0.6340277777777777 | 3.525 |
| 0.6347222222222222 | 3.525 |
| 0.6354166666666666 | 3.525 |
| 0.6361111111111112 | 3.525 |
| 0.6368055555555555 | 3.525 |
| 0.6375000000000001 | 3.525 |
| 0.6381944444444444 | 3.525 |
| 0.638888888888889 | 3.525 |
| 0.6395833333333333 | 3.525 |
| 0.6402777777777778 | 3.525 |
| 0.6409722222222222 | 3.525 |
| 0.6416666666666667 | 3.525 |
| 0.642361111111111 | 3.525 |
| 0.6430555555555556 | 0 |
| 0.6437499999999999 | 0 |
| 0.6444444444444445 | 0 |
| 0.6451388888888888 | 0 |
| 0.6458333333333334 | 0 |
| 0.6465277777777778 | 0 |
| 0.6472222222222223 | 0 |
| 0.6479166666666667 | 0 |
| 0.6486111111111111 | 0 |
| 0.6493055555555556 | 0 |
| 0.65 | 0 |
| 0.6506944444444445 | 0 |
| 0.6513888888888889 | 0 |
| 0.6520833333333333 | 0 |
| 0.6527777777777778 | 0 |
| 0.6534722222222222 | 0 |
| 0.6541666666666667 | 0 |
| 0.6548611111111111 | 0 |
| 0.6555555555555556 | 0 |
| 0.65625 | 0 |
| 0.6569444444444444 | 0 |
| 0.6576388888888889 | 0 |
| 0.6583333333333333 | 0 |
| 0.6590277777777778 | 0 |
| 0.6597222222222222 | 0 |
| 0.6604166666666667 | 0 |
| 0.6611111111111111 | 0 |
| 0.6618055555555555 | 0 |
| 0.6625 | 0 |
| 0.6631944444444444 | 0 |
| 0.6638888888888889 | 0 |
| 0.6645833333333333 | 0 |
| 0.6652777777777777 | 0 |
| 0.6659722222222222 | 0 |
| 0.6666666666666666 | 0 |
| 0.6673611111111111 | 0 |
| 0.6680555555555556 | 0 |
| 0.6687500000000001 | 0 |
| 0.6694444444444444 | 0 |
| 0.6701388888888888 | 0 |
| 0.6708333333333334 | 0 |
| 0.6715277777777778 | 0 |
| 0.6722222222222222 | 0 |
| 0.6729166666666666 | 0 |
| 0.6736111111111112 | 0 |
| 0.6743055555555556 | 0 |
| 0.6749999999999999 | 0 |
| 0.6756944444444444 | 0 |
| 0.6763888888888889 | 0 |
| 0.6770833333333334 | 0 |
| 0.6777777777777777 | 0 |
| 0.6784722222222223 | 0 |
| 0.6791666666666667 | 0 |
| 0.6798611111111111 | 0 |
| 0.6805555555555555 | 0 |
| 0.68125 | 0 |
| 0.6819444444444445 | 0 |
| 0.6826388888888889 | 0 |
| 0.6833333333333332 | 0 |
| 0.6840277777777778 | 0 |
| 0.6847222222222222 | 0 |
| 0.6854166666666667 | 0 |
| 0.686111111111111 | 0 |
| 0.6868055555555556 | 0 |
| 0.6875 | 0 |
| 0.6881944444444444 | 0 |
| 0.688888888888889 | 0 |
| 0.6895833333333333 | 0 |
| 0.6902777777777778 | 0 |
| 0.6909722222222222 | 0 |
| 0.6916666666666668 | 0 |
| 0.6923611111111111 | 0 |
| 0.6930555555555555 | 0 |
| 0.69375 | 0 |
| 0.6944444444444445 | 0 |
| 0.6951388888888889 | 0 |
| 0.6958333333333333 | 0 |
| 0.6965277777777777 | 0 |
| 0.6972222222222223 | 0 |
| 0.6979166666666666 | 0 |
| 0.6986111111111111 | 0 |
| 0.6993055555555556 | 0 |
| 0.7000000000000001 | 0 |
| 0.7006944444444444 | 0 |
| 0.7013888888888888 | 0 |
| 0.7020833333333334 | 0 |
| 0.7027777777777778 | 0 |
| 0.7034722222222222 | 0 |
| 0.7041666666666666 | 0 |
| 0.7048611111111112 | 0 |
| 0.7055555555555556 | 0 |
| 0.7062499999999999 | 0 |
| 0.7069444444444444 | 0 |
| 0.7076388888888889 | 0 |
| 0.7083333333333334 | 0 |
| 0.7090277777777777 | 0 |
| 0.7097222222222223 | 0 |
| 0.7104166666666667 | 0 |
| 0.7111111111111111 | 0 |
| 0.7118055555555555 | 0 |
| 0.7125 | 0 |
| 0.7131944444444445 | 0 |
| 0.7138888888888889 | 0 |
| 0.7145833333333332 | 0 |
| 0.7152777777777778 | 0 |
| 0.7159722222222222 | 0 |
| 0.7166666666666667 | 0 |
| 0.717361111111111 | 0 |
| 0.7180555555555556 | 0 |
| 0.71875 | 0 |
| 0.7194444444444444 | 0 |
| 0.720138888888889 | 0 |
| 0.7208333333333333 | 0 |
| 0.7215277777777778 | 0 |
| 0.7222222222222222 | 0 |
| 0.7229166666666668 | 0 |
| 0.7236111111111111 | 0 |
| 0.7243055555555555 | 0 |
| 0.725 | 0 |
| 0.7256944444444445 | 0 |
| 0.7263888888888889 | 0 |
| 0.7270833333333333 | 0 |
| 0.7277777777777777 | 0 |
| 0.7284722222222223 | 0 |
| 0.7291666666666666 | 0 |
| 0.7298611111111111 | 0 |
| 0.7305555555555556 | 0 |
| 0.7312500000000001 | 0 |
| 0.7319444444444444 | 0 |
| 0.7326388888888888 | 0 |
| 0.7333333333333334 | 0 |
| 0.7340277777777778 | 0 |
| 0.7347222222222222 | 0 |
| 0.7354166666666666 | 0 |
| 0.7361111111111112 | 0 |
| 0.7368055555555556 | 0 |
| 0.7374999999999999 | 0 |
| 0.7381944444444444 | 0 |
| 0.7388888888888889 | 0 |
| 0.7395833333333334 | 0 |
| 0.7402777777777777 | 0 |
| 0.7409722222222223 | 0 |
| 0.7416666666666667 | 0 |
| 0.7423611111111111 | 0 |
| 0.7430555555555555 | 0 |
| 0.74375 | 0 |
| 0.7444444444444445 | 0 |
| 0.7451388888888889 | 0 |
| 0.7458333333333332 | 0 |
| 0.7465277777777778 | 0 |
| 0.7472222222222222 | 0 |
| 0.7479166666666667 | 0 |
| 0.748611111111111 | 0 |
| 0.7493055555555556 | 0 |
| 0.75 | 0 |
| 0.7506944444444444 | 0 |
| 0.751388888888889 | 0 |
| 0.7520833333333333 | 0 |
| 0.7527777777777778 | 0 |
| 0.7534722222222222 | 0 |
| 0.7541666666666668 | 0 |
| 0.7548611111111111 | 0 |
| 0.7555555555555555 | 0 |
| 0.75625 | 0 |
| 0.7569444444444445 | 0 |
| 0.7576388888888889 | 0 |
| 0.7583333333333333 | 0 |
| 0.7590277777777777 | 0 |
| 0.7597222222222223 | 0 |
| 0.7604166666666666 | 0 |
| 0.7611111111111111 | 0 |
| 0.7618055555555556 | 0 |
| 0.7625000000000001 | 0 |
| 0.7631944444444444 | 0 |
| 0.7638888888888888 | 0 |
| 0.7645833333333334 | 0 |
| 0.7652777777777778 | 0 |
| 0.7659722222222222 | 0 |
| 0.7666666666666666 | 0 |
| 0.7673611111111112 | 0 |
| 0.7680555555555556 | 0 |
| 0.7687499999999999 | 0 |
| 0.7694444444444444 | 0 |
| 0.7701388888888889 | 0 |
| 0.7708333333333334 | 0 |
| 0.7715277777777777 | 0 |
| 0.7722222222222223 | 0 |
| 0.7729166666666667 | 0 |
| 0.7736111111111111 | 0 |
| 0.7743055555555555 | 0 |
| 0.775 | 0 |
| 0.7756944444444445 | 0 |
| 0.7763888888888889 | 0 |
| 0.7770833333333332 | 0 |
| 0.7777777777777778 | 0 |
| 0.7784722222222222 | 0 |
| 0.7791666666666667 | 0 |
| 0.779861111111111 | 0 |
| 0.7805555555555556 | 0 |
| 0.78125 | 0 |
| 0.7819444444444444 | 0 |
| 0.782638888888889 | 0 |
| 0.7833333333333333 | 0 |
| 0.7840277777777778 | 0 |
| 0.7847222222222222 | 0 |
| 0.7854166666666668 | 0 |
| 0.7861111111111111 | 0 |
| 0.7868055555555555 | 0 |
| 0.7875 | 0 |
| 0.7881944444444445 | 0 |
| 0.7888888888888889 | 0 |
| 0.7895833333333333 | 0 |
| 0.7902777777777777 | 0 |
| 0.7909722222222223 | 0 |
| 0.7916666666666666 | 0 |
| 0.7923611111111111 | 0 |
| 0.7930555555555556 | 0 |
| 0.7937500000000001 | 0 |
| 0.7944444444444444 | 0 |
| 0.7951388888888888 | 0 |
| 0.7958333333333334 | 0 |
| 0.7965277777777778 | 0 |
| 0.7972222222222222 | 0 |
| 0.7979166666666666 | 0 |
| 0.7986111111111112 | 0 |
| 0.7993055555555556 | 0 |
| 0.7999999999999999 | 0 |
| 0.8006944444444444 | 0 |
| 0.8013888888888889 | 0 |
| 0.8020833333333334 | 0 |
| 0.8027777777777777 | 0 |
| 0.8034722222222223 | 0 |
| 0.8041666666666667 | 0 |
| 0.8048611111111111 | 0 |
| 0.8055555555555555 | 0 |
| 0.80625 | 0 |
| 0.8069444444444445 | 0 |
| 0.8076388888888889 | 0 |
| 0.8083333333333332 | 0 |
| 0.8090277777777778 | 0 |
| 0.8097222222222222 | 0 |
| 0.8104166666666667 | 0 |
| 0.811111111111111 | 0 |
| 0.8118055555555556 | 0 |
| 0.8125 | 0 |
| 0.8131944444444444 | 0 |
| 0.813888888888889 | 0 |
| 0.8145833333333333 | 0 |
| 0.8152777777777778 | 0 |
| 0.8159722222222222 | 0 |
| 0.8166666666666668 | 0 |
| 0.8173611111111111 | 0 |
| 0.8180555555555555 | 0 |
| 0.81875 | 0 |
| 0.8194444444444445 | 0 |
| 0.8201388888888889 | 0 |
| 0.8208333333333333 | 0 |
| 0.8215277777777777 | 0 |
| 0.8222222222222223 | 0 |
| 0.8229166666666666 | 0 |
| 0.8236111111111111 | 0 |
| 0.8243055555555556 | 0 |
| 0.8250000000000001 | 0 |
| 0.8256944444444444 | 0 |
| 0.8263888888888888 | 0 |
| 0.8270833333333334 | 0 |
| 0.8277777777777778 | 0 |
| 0.8284722222222222 | 0 |
| 0.8291666666666666 | 0 |
| 0.8298611111111112 | 0 |
| 0.8305555555555556 | 0 |
| 0.8312499999999999 | 0 |
| 0.8319444444444444 | 0 |
| 0.8326388888888889 | 0 |
| 0.8333333333333334 | 0 |
| 0.8340277777777777 | 0 |
| 0.8347222222222223 | 0 |
| 0.8354166666666667 | 0 |
| 0.8361111111111111 | 0 |
| 0.8368055555555555 | 0 |
| 0.8375 | 0 |
| 0.8381944444444445 | 0 |
| 0.8388888888888889 | 0 |
| 0.8395833333333332 | 0 |
| 0.8402777777777778 | 0 |
| 0.8409722222222222 | 0 |
| 0.8416666666666667 | 0 |
| 0.842361111111111 | 0 |
| 0.8430555555555556 | 0 |
| 0.84375 | 0 |
| 0.8444444444444444 | 0 |
| 0.845138888888889 | 0 |
| 0.8458333333333333 | 0 |
| 0.8465277777777778 | 0 |
| 0.8472222222222222 | 0 |
| 0.8479166666666668 | 0 |
| 0.8486111111111111 | 0 |
| 0.8493055555555555 | 0 |
| 0.85 | 0 |
| 0.8506944444444445 | 0 |
| 0.8513888888888889 | 0 |
| 0.8520833333333333 | 0 |
| 0.8527777777777777 | 0 |
| 0.8534722222222223 | 0 |
| 0.8541666666666666 | 0 |
| 0.8548611111111111 | 0 |
| 0.8555555555555556 | 0 |
| 0.8562500000000001 | 0 |
| 0.8569444444444444 | 0 |
| 0.8576388888888888 | 0 |
| 0.8583333333333334 | 0 |
| 0.8590277777777778 | 0 |
| 0.8597222222222222 | 0 |
| 0.8604166666666666 | 0 |
| 0.8611111111111112 | 0 |
| 0.8618055555555556 | 0 |
| 0.8624999999999999 | 0 |
| 0.8631944444444444 | 0 |
| 0.8638888888888889 | 0 |
| 0.8645833333333334 | 0 |
| 0.8652777777777777 | 0 |
| 0.8659722222222223 | 0 |
| 0.8666666666666667 | 0 |
| 0.8673611111111111 | 0 |
| 0.8680555555555555 | 0 |
| 0.86875 | 0 |
| 0.8694444444444445 | 0 |
| 0.8701388888888889 | 0 |
| 0.8708333333333332 | 0 |
| 0.8715277777777778 | 0 |
| 0.8722222222222222 | 0 |
| 0.8729166666666667 | 0 |
| 0.873611111111111 | 0 |
| 0.8743055555555556 | 0 |
| 0.875 | 0 |
| 0.8756944444444444 | 0 |
| 0.876388888888889 | 0 |
| 0.8770833333333333 | 0 |
| 0.8777777777777778 | 0 |
| 0.8784722222222222 | 0 |
| 0.8791666666666668 | 0 |
| 0.8798611111111111 | 0 |
| 0.8805555555555555 | 0 |
| 0.88125 | 0 |
| 0.8819444444444445 | 0 |
| 0.8826388888888889 | 0 |
| 0.8833333333333333 | 0 |
| 0.8840277777777777 | 0 |
| 0.8847222222222223 | 0 |
| 0.8854166666666666 | 0 |
| 0.8861111111111111 | 0 |
| 0.8868055555555556 | 0 |
| 0.8875000000000001 | 0 |
| 0.8881944444444444 | 0 |
| 0.8888888888888888 | 0 |
| 0.8895833333333334 | 0 |
| 0.8902777777777778 | 0 |
| 0.8909722222222222 | 0 |
| 0.8916666666666666 | 0 |
| 0.8923611111111112 | 0 |
| 0.8930555555555556 | 0 |
| 0.8937499999999999 | 0 |
| 0.8944444444444444 | 0 |
| 0.8951388888888889 | 0 |
| 0.8958333333333334 | 0 |
| 0.8965277777777777 | 0 |
| 0.8972222222222223 | 0 |
| 0.8979166666666667 | 0 |
| 0.8986111111111111 | 0 |
| 0.8993055555555555 | 0 |
| 0.9 | 0 |
| 0.9006944444444445 | 0 |
| 0.9013888888888889 | 0 |
| 0.9020833333333332 | 0 |
| 0.9027777777777778 | 0 |
| 0.9034722222222222 | 0 |
| 0.9041666666666667 | 0 |
| 0.904861111111111 | 0 |
| 0.9055555555555556 | 0 |
| 0.90625 | 0 |
| 0.9069444444444444 | 0 |
| 0.907638888888889 | 0 |
| 0.9083333333333333 | 0 |
| 0.9090277777777778 | 0 |
| 0.9097222222222222 | 0 |
| 0.9104166666666668 | 0 |
| 0.9111111111111111 | 0 |
| 0.9118055555555555 | 0 |
| 0.9125 | 0 |
| 0.9131944444444445 | 0 |
| 0.9138888888888889 | 0 |
| 0.9145833333333333 | 0 |
| 0.9152777777777777 | 0 |
| 0.9159722222222223 | 0 |
| 0.9166666666666666 | 0 |
| 0.9173611111111111 | 0 |
| 0.9180555555555556 | 0 |
| 0.9187500000000001 | 0 |
| 0.9194444444444444 | 0 |
| 0.9201388888888888 | 0 |
| 0.9208333333333334 | 0 |
| 0.9215277777777778 | 0 |
| 0.9222222222222222 | 0 |
| 0.9229166666666666 | 0 |
| 0.9236111111111112 | 0 |
| 0.9243055555555556 | 0 |
| 0.9249999999999999 | 0 |
| 0.9256944444444444 | 0 |
| 0.9263888888888889 | 0 |
| 0.9270833333333334 | 0 |
| 0.9277777777777777 | 0 |
| 0.9284722222222223 | 0 |
| 0.9291666666666667 | 0 |
| 0.9298611111111111 | 0 |
| 0.9305555555555555 | 0 |
| 0.93125 | 0 |
| 0.9319444444444445 | 0 |
| 0.9326388888888889 | 0 |
| 0.9333333333333332 | 0 |
| 0.9340277777777778 | 0 |
| 0.9347222222222222 | 0 |
| 0.9354166666666667 | 0 |
| 0.936111111111111 | 0 |
| 0.9368055555555556 | 0 |
| 0.9375 | 0 |
| 0.9381944444444444 | 0 |
| 0.938888888888889 | 0 |
| 0.9395833333333333 | 0 |
| 0.9402777777777778 | 0 |
| 0.9409722222222222 | 0 |
| 0.9416666666666668 | 0 |
| 0.9423611111111111 | 0 |
| 0.9430555555555555 | 0 |
| 0.94375 | 0 |
| 0.9444444444444445 | 0 |
| 0.9451388888888889 | 0 |
| 0.9458333333333333 | 0 |
| 0.9465277777777777 | 0 |
| 0.9472222222222223 | 0 |
| 0.9479166666666666 | 0 |
| 0.9486111111111111 | 0 |
| 0.9493055555555556 | 0 |
| 0.9500000000000001 | 0 |
| 0.9506944444444444 | 0 |
| 0.9513888888888888 | 0 |
| 0.9520833333333334 | 0 |
| 0.9527777777777778 | 0 |
| 0.9534722222222222 | 0 |
| 0.9541666666666666 | 0 |
| 0.9548611111111112 | 0 |
| 0.9555555555555556 | 0 |
| 0.9562499999999999 | 0 |
| 0.9569444444444444 | 0 |
| 0.9576388888888889 | 0 |
| 0.9583333333333334 | 0 |
| 0.9590277777777777 | 0 |
| 0.9597222222222223 | 0 |
| 0.9604166666666667 | 0 |
| 0.9611111111111111 | 0 |
| 0.9618055555555555 | 0 |
| 0.9625 | 0 |
| 0.9631944444444445 | 0 |
| 0.9638888888888889 | 0 |
| 0.9645833333333332 | 0 |
| 0.9652777777777778 | 0 |
| 0.9659722222222222 | 0 |
| 0.9666666666666667 | 0 |
| 0.967361111111111 | 0 |
| 0.9680555555555556 | 0 |
| 0.96875 | 0 |
| 0.9694444444444444 | 0 |
| 0.970138888888889 | 0 |
| 0.9708333333333333 | 0 |
| 0.9715277777777778 | 0 |
| 0.9722222222222222 | 0 |
| 0.9729166666666668 | 0 |
| 0.9736111111111111 | 0 |
| 0.9743055555555555 | 0 |
| 0.975 | 0 |
| 0.9756944444444445 | 0 |
| 0.9763888888888889 | 0 |
| 0.9770833333333333 | 0 |
| 0.9777777777777777 | 0 |
| 0.9784722222222223 | 0 |
| 0.9791666666666666 | 0 |
| 0.9798611111111111 | 0 |
| 0.9805555555555556 | 0 |
| 0.9812500000000001 | 0 |
| 0.9819444444444444 | 0 |
| 0.9826388888888888 | 0 |
| 0.9833333333333334 | 0 |
| 0.9840277777777778 | 0 |
| 0.9847222222222222 | 0 |
| 0.9854166666666666 | 0 |
| 0.9861111111111112 | 0 |
| 0.9868055555555556 | 0 |
| 0.9874999999999999 | 0 |
| 0.9881944444444444 | 0 |
| 0.9888888888888889 | 0 |
| 0.9895833333333334 | 0 |
| 0.9902777777777777 | 0 |
| 0.9909722222222223 | 0 |
| 0.9916666666666667 | 0 |
| 0.9923611111111111 | 0 |
| 0.9930555555555555 | 0 |
| 0.99375 | 0 |
| 0.9944444444444445 | 0 |
| 0.9951388888888889 | 0 |
| 0.9958333333333332 | 0 |
| 0.9965277777777778 | 0 |
| 0.9972222222222222 | 0 |
| 0.9979166666666667 | 0 |
| 0.998611111111111 | 0 |
| 0.9993055555555556 | 0 |